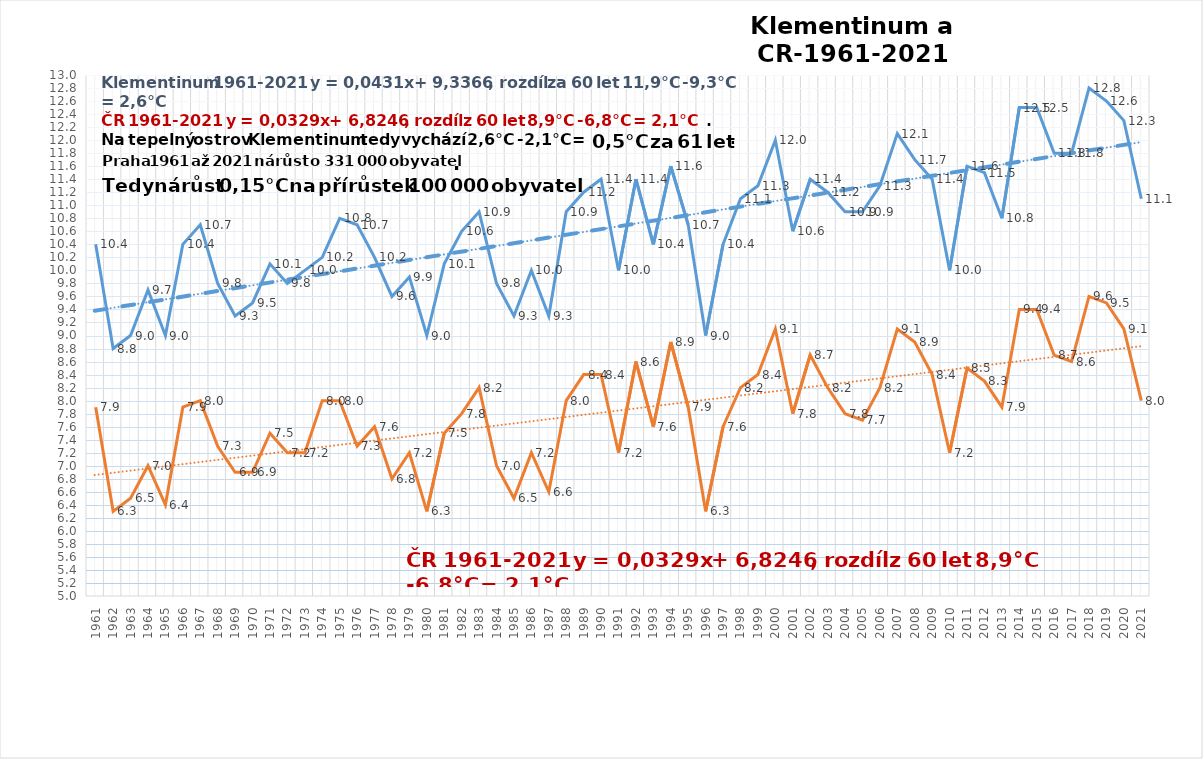
| Category | Klementinum [°C] | ČR roční teplota [°C] |
|---|---|---|
| 1961 | 10.4 | 7.9 |
| 1962 | 8.8 | 6.3 |
| 1963 | 9 | 6.5 |
| 1964 | 9.7 | 7 |
| 1965 | 9 | 6.4 |
| 1966 | 10.4 | 7.9 |
| 1967 | 10.7 | 8 |
| 1968 | 9.8 | 7.3 |
| 1969 | 9.3 | 6.9 |
| 1970 | 9.5 | 6.9 |
| 1971 | 10.1 | 7.5 |
| 1972 | 9.8 | 7.2 |
| 1973 | 10 | 7.2 |
| 1974 | 10.2 | 8 |
| 1975 | 10.8 | 8 |
| 1976 | 10.7 | 7.3 |
| 1977 | 10.2 | 7.6 |
| 1978 | 9.6 | 6.8 |
| 1979 | 9.9 | 7.2 |
| 1980 | 9 | 6.3 |
| 1981 | 10.1 | 7.5 |
| 1982 | 10.6 | 7.8 |
| 1983 | 10.9 | 8.2 |
| 1984 | 9.8 | 7 |
| 1985 | 9.3 | 6.5 |
| 1986 | 10 | 7.2 |
| 1987 | 9.3 | 6.6 |
| 1988 | 10.9 | 8 |
| 1989 | 11.2 | 8.4 |
| 1990 | 11.4 | 8.4 |
| 1991 | 10 | 7.2 |
| 1992 | 11.4 | 8.6 |
| 1993 | 10.4 | 7.6 |
| 1994 | 11.6 | 8.9 |
| 1995 | 10.7 | 7.9 |
| 1996 | 9 | 6.3 |
| 1997 | 10.4 | 7.6 |
| 1998 | 11.1 | 8.2 |
| 1999 | 11.3 | 8.4 |
| 2000 | 12 | 9.1 |
| 2001 | 10.6 | 7.8 |
| 2002 | 11.4 | 8.7 |
| 2003 | 11.2 | 8.2 |
| 2004 | 10.9 | 7.8 |
| 2005 | 10.9 | 7.7 |
| 2006 | 11.3 | 8.2 |
| 2007 | 12.1 | 9.1 |
| 2008 | 11.7 | 8.9 |
| 2009 | 11.4 | 8.4 |
| 2010 | 10 | 7.2 |
| 2011 | 11.6 | 8.5 |
| 2012 | 11.5 | 8.3 |
| 2013 | 10.8 | 7.9 |
| 2014 | 12.5 | 9.4 |
| 2015 | 12.5 | 9.4 |
| 2016 | 11.8 | 8.7 |
| 2017 | 11.8 | 8.6 |
| 2018 | 12.8 | 9.6 |
| 2019 | 12.6 | 9.5 |
| 2020 | 12.3 | 9.1 |
| 2021 | 11.1 | 8 |